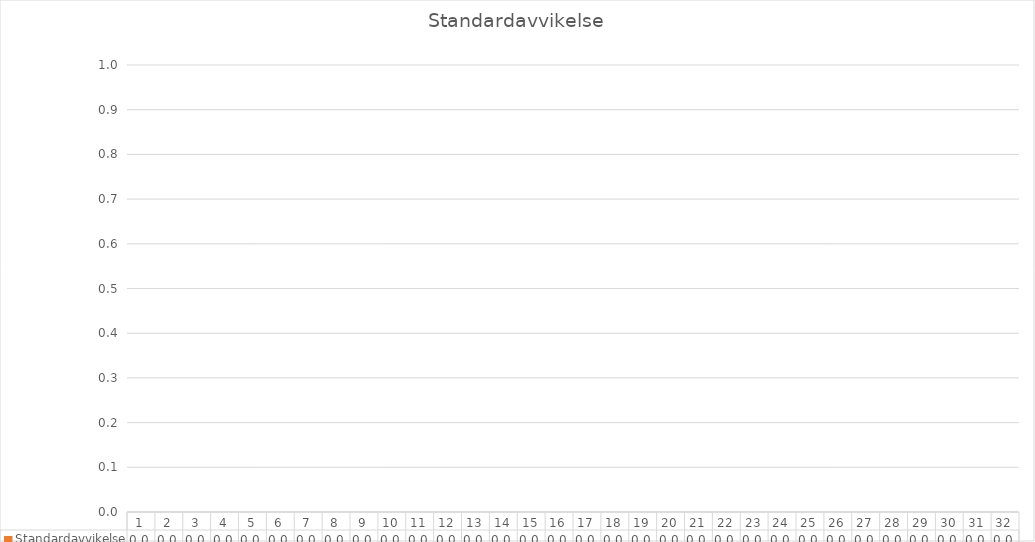
| Category | Standardavvikelse |
|---|---|
| 0 | 0 |
| 1 | 0 |
| 2 | 0 |
| 3 | 0 |
| 4 | 0 |
| 5 | 0 |
| 6 | 0 |
| 7 | 0 |
| 8 | 0 |
| 9 | 0 |
| 10 | 0 |
| 11 | 0 |
| 12 | 0 |
| 13 | 0 |
| 14 | 0 |
| 15 | 0 |
| 16 | 0 |
| 17 | 0 |
| 18 | 0 |
| 19 | 0 |
| 20 | 0 |
| 21 | 0 |
| 22 | 0 |
| 23 | 0 |
| 24 | 0 |
| 25 | 0 |
| 26 | 0 |
| 27 | 0 |
| 28 | 0 |
| 29 | 0 |
| 30 | 0 |
| 31 | 0 |